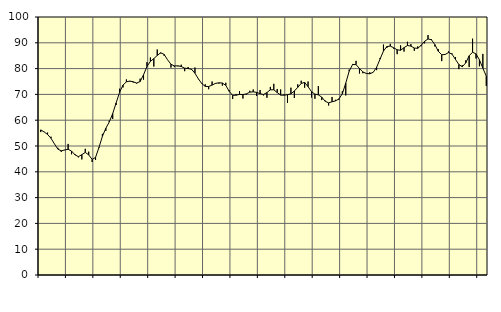
| Category | Piggar | Series 1 |
|---|---|---|
| nan | 55.4 | 56.25 |
| 87.0 | 55.5 | 55.45 |
| 87.0 | 55.2 | 54.48 |
| 87.0 | 53.6 | 53 |
| nan | 50.8 | 50.82 |
| 88.0 | 49.3 | 48.79 |
| 88.0 | 47.7 | 48.13 |
| 88.0 | 48.4 | 48.47 |
| nan | 50.8 | 48.72 |
| 89.0 | 46.8 | 48.03 |
| 89.0 | 46.9 | 46.59 |
| 89.0 | 45.6 | 45.87 |
| nan | 44.8 | 46.64 |
| 90.0 | 48.9 | 47.52 |
| 90.0 | 47.8 | 46.57 |
| 90.0 | 43.8 | 44.8 |
| nan | 44.6 | 45.58 |
| 91.0 | 49.2 | 49.44 |
| 91.0 | 54.7 | 53.76 |
| 91.0 | 55.9 | 56.87 |
| nan | 59.8 | 59.3 |
| 92.0 | 60.5 | 62.55 |
| 92.0 | 65.9 | 66.69 |
| 92.0 | 72.2 | 70.76 |
| nan | 72.7 | 73.61 |
| 93.0 | 75.8 | 74.86 |
| 93.0 | 75 | 75.17 |
| 93.0 | 74.6 | 74.88 |
| nan | 74.2 | 74.39 |
| 94.0 | 76.1 | 74.98 |
| 94.0 | 75.7 | 77.6 |
| 94.0 | 82.5 | 80.82 |
| nan | 84.3 | 82.81 |
| 95.0 | 80.8 | 83.87 |
| 95.0 | 87.4 | 85.09 |
| 95.0 | 85.9 | 86.15 |
| nan | 85 | 85.51 |
| 96.0 | 83.4 | 83.43 |
| 96.0 | 80.4 | 81.68 |
| 96.0 | 80.6 | 81.03 |
| nan | 80.9 | 81.08 |
| 97.0 | 81.5 | 80.82 |
| 97.0 | 79 | 80.17 |
| 97.0 | 80.6 | 80.03 |
| nan | 79.5 | 79.73 |
| 98.0 | 80.4 | 78.2 |
| 98.0 | 75.9 | 76.02 |
| 98.0 | 74.4 | 74.2 |
| nan | 73.9 | 73.1 |
| 99.0 | 72 | 73.06 |
| 99.0 | 75 | 73.61 |
| 99.0 | 74.4 | 74.27 |
| nan | 74.2 | 74.49 |
| 0.0 | 73.4 | 74.42 |
| 0.0 | 74.5 | 73.49 |
| 0.0 | 71.6 | 71.17 |
| nan | 68.2 | 69.64 |
| 1.0 | 70.1 | 69.68 |
| 1.0 | 71.3 | 70.01 |
| 1.0 | 68.4 | 69.91 |
| nan | 69.9 | 70.2 |
| 2.0 | 71.4 | 70.86 |
| 2.0 | 71.9 | 71 |
| 2.0 | 69.4 | 70.78 |
| nan | 71.7 | 70.28 |
| 3.0 | 69.6 | 69.96 |
| 3.0 | 68.7 | 70.72 |
| 3.0 | 72.9 | 71.78 |
| nan | 74.1 | 71.79 |
| 4.0 | 72.1 | 70.73 |
| 4.0 | 71.9 | 69.72 |
| 4.0 | 70 | 69.68 |
| nan | 66.7 | 69.89 |
| 5.0 | 72.6 | 70.22 |
| 5.0 | 68.6 | 71.31 |
| 5.0 | 73.9 | 72.74 |
| nan | 75.3 | 74.24 |
| 6.0 | 72.6 | 74.65 |
| 6.0 | 75 | 73.01 |
| 6.0 | 68.8 | 71.06 |
| nan | 68.3 | 70.11 |
| 7.0 | 73.2 | 69.82 |
| 7.0 | 67.8 | 68.94 |
| 7.0 | 67.6 | 67.33 |
| nan | 65.7 | 66.72 |
| 8.0 | 69 | 67.14 |
| 8.0 | 67.9 | 67.48 |
| 8.0 | 67.9 | 68.23 |
| nan | 71.2 | 70.26 |
| 9.0 | 69.6 | 74.36 |
| 9.0 | 79.6 | 78.98 |
| 9.0 | 81.8 | 81.6 |
| nan | 83 | 81.55 |
| 10.0 | 78.1 | 80.02 |
| 10.0 | 78.2 | 78.7 |
| 10.0 | 78 | 78.12 |
| nan | 78.6 | 77.98 |
| 11.0 | 78.6 | 78.56 |
| 11.0 | 79.4 | 80.49 |
| 11.0 | 84.1 | 83.67 |
| nan | 89.3 | 86.79 |
| 12.0 | 88 | 88.56 |
| 12.0 | 89.6 | 88.72 |
| 12.0 | 87.7 | 88.06 |
| nan | 85.6 | 87.28 |
| 13.0 | 89 | 87.11 |
| 13.0 | 86.6 | 88.12 |
| 13.0 | 90.4 | 88.94 |
| nan | 89.5 | 88.72 |
| 14.0 | 86.9 | 87.97 |
| 14.0 | 88.6 | 87.86 |
| 14.0 | 88.7 | 89.04 |
| nan | 89.8 | 90.58 |
| 15.0 | 93 | 91.49 |
| 15.0 | 91.4 | 91.18 |
| 15.0 | 88.6 | 89.29 |
| nan | 87.5 | 86.71 |
| 16.0 | 82.9 | 85.36 |
| 16.0 | 85.4 | 85.48 |
| 16.0 | 86.7 | 86.23 |
| nan | 85.9 | 85.62 |
| 17.0 | 84.5 | 83.56 |
| 17.0 | 79.8 | 81.58 |
| 17.0 | 81.3 | 80.72 |
| nan | 83.2 | 82.2 |
| 18.0 | 80.6 | 84.96 |
| 18.0 | 91.6 | 86.36 |
| 18.0 | 83.9 | 85.7 |
| nan | 80.9 | 83.4 |
| 19.0 | 85.7 | 80.18 |
| 19.0 | 73.3 | 77.08 |